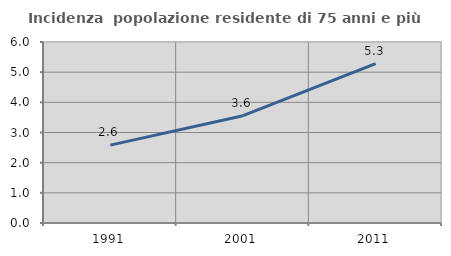
| Category | Incidenza  popolazione residente di 75 anni e più |
|---|---|
| 1991.0 | 2.581 |
| 2001.0 | 3.556 |
| 2011.0 | 5.281 |